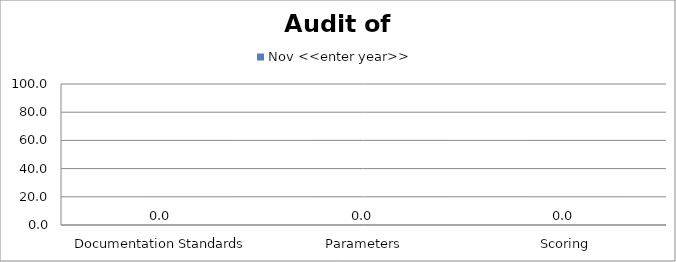
| Category | Nov <<enter year>> |
|---|---|
|  Documentation Standards | 0 |
|  Parameters | 0 |
|  Scoring | 0 |